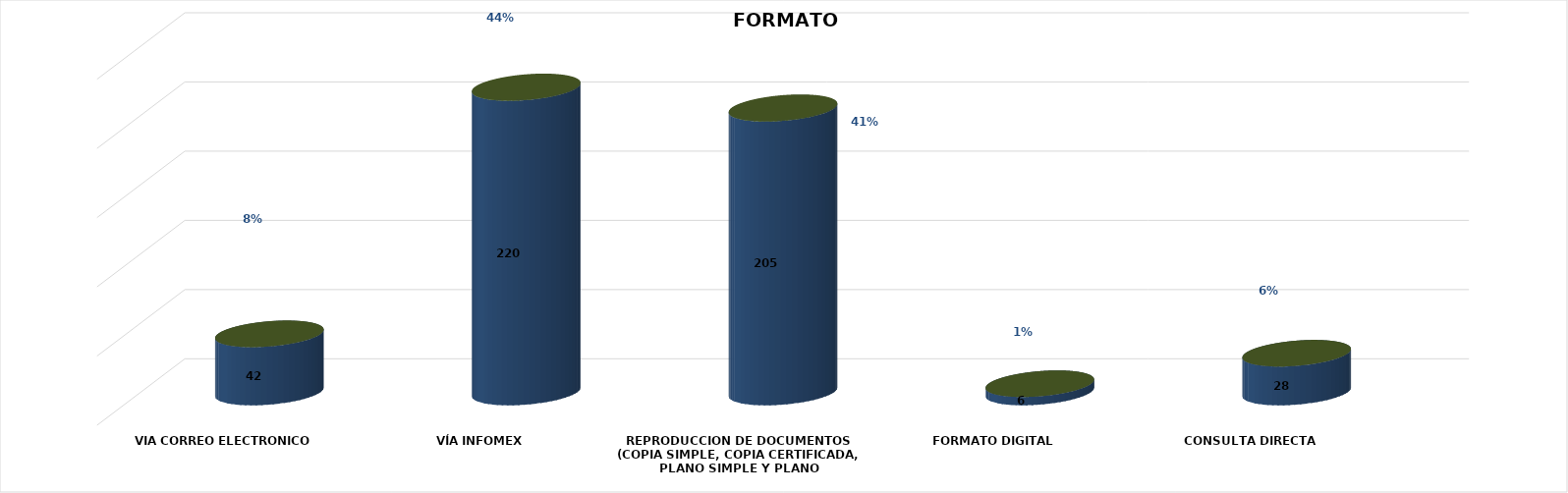
| Category | Series 0 | Series 1 | Series 2 | Series 3 | Series 4 |
|---|---|---|---|---|---|
| VIA CORREO ELECTRONICO |  |  |  | 42 | 0.084 |
| VÍA INFOMEX |  |  |  | 220 | 0.439 |
| REPRODUCCION DE DOCUMENTOS (COPIA SIMPLE, COPIA CERTIFICADA, PLANO SIMPLE Y PLANO CERTIFICADO) |  |  |  | 205 | 0.409 |
| FORMATO DIGITAL |  |  |  | 6 | 0.012 |
| CONSULTA DIRECTA |  |  |  | 28 | 0.056 |